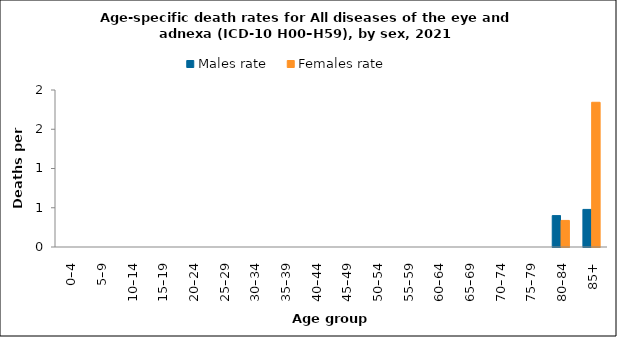
| Category | Males rate | Females rate |
|---|---|---|
| 0–4 | 0 | 0 |
| 5–9 | 0 | 0 |
| 10–14 | 0 | 0 |
| 15–19 | 0 | 0 |
| 20–24 | 0 | 0 |
| 25–29 | 0 | 0 |
| 30–34 | 0 | 0 |
| 35–39 | 0 | 0 |
| 40–44 | 0 | 0 |
| 45–49 | 0 | 0 |
| 50–54 | 0 | 0 |
| 55–59 | 0 | 0 |
| 60–64 | 0 | 0 |
| 65–69 | 0 | 0 |
| 70–74 | 0 | 0 |
| 75–79 | 0 | 0 |
| 80–84 | 0.4 | 0.338 |
| 85+ | 0.479 | 1.844 |